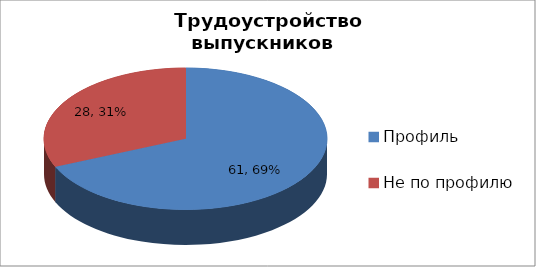
| Category | Series 0 |
|---|---|
| Профиль | 61 |
| Не по профилю | 28 |